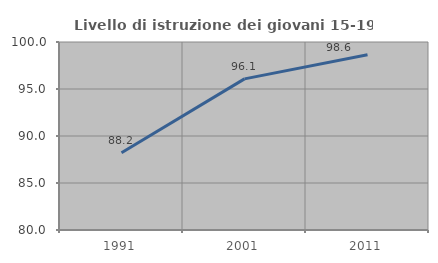
| Category | Livello di istruzione dei giovani 15-19 anni |
|---|---|
| 1991.0 | 88.218 |
| 2001.0 | 96.078 |
| 2011.0 | 98.636 |